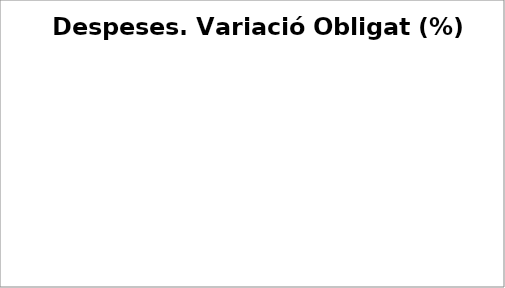
| Category | Series 0 |
|---|---|
| Despeses de personal | 0.059 |
| Despeses en béns corrents i serveis | -0.061 |
| Despeses financeres | -0.757 |
| Transferències corrents | -0.104 |
| Fons de contingència | 0 |
| Inversions reals | -0.657 |
| Transferències de capital | 1.772 |
| Actius financers | 0.062 |
| Passius financers | 0.017 |